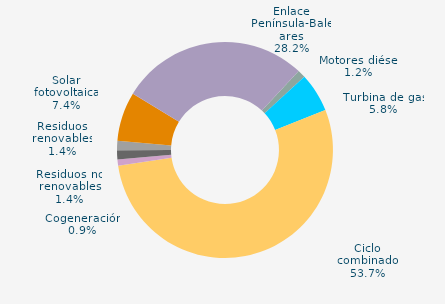
| Category | Series 0 |
|---|---|
| Carbón | 0 |
| Motores diésel | 1.186 |
| Turbina de gas | 5.849 |
| Ciclo combinado | 53.704 |
| Generación auxiliar | 0 |
| Cogeneración | 0.919 |
| Residuos no renovables | 1.379 |
| Residuos renovables | 1.379 |
| Eólica | 0 |
| Solar fotovoltaica | 7.374 |
| Otras renovables | 0.008 |
| Enlace Península-Baleares | 28.203 |